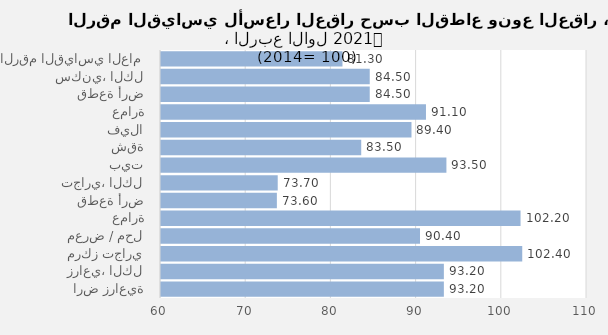
| Category | 2021 |
|---|---|
| الرقم القياسي العام | 81.3 |
| سكني، الكل | 84.5 |
| قطعة أرض | 84.5 |
| عمارة | 91.1 |
| فيلا | 89.4 |
| شقة | 83.5 |
| بيت | 93.5 |
| تجاري، الكل | 73.7 |
| قطعة أرض | 73.6 |
| عمارة | 102.2 |
| معرض / محل | 90.4 |
| مركز تجاري | 102.4 |
| زراعي، الكل | 93.2 |
| ارض زراعية | 93.2 |